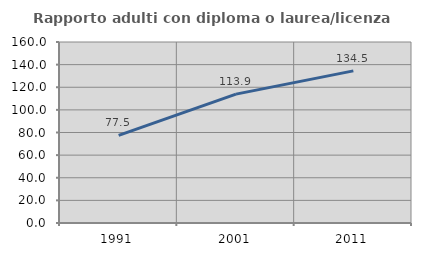
| Category | Rapporto adulti con diploma o laurea/licenza media  |
|---|---|
| 1991.0 | 77.462 |
| 2001.0 | 113.93 |
| 2011.0 | 134.492 |